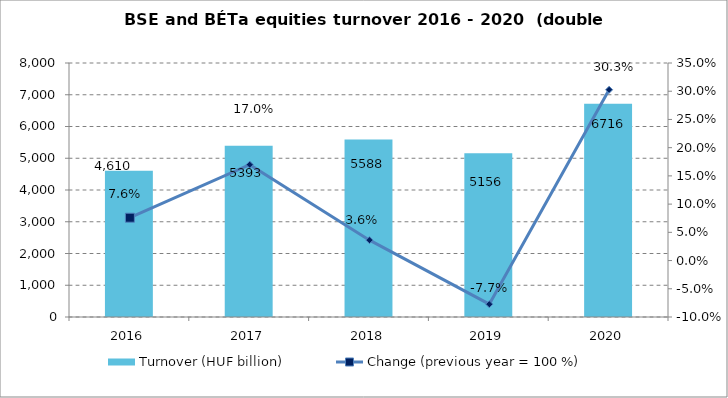
| Category | Turnover (HUF billion) |
|---|---|
| 2016.0 | 4610 |
| 2017.0 | 5393 |
| 2018.0 | 5588 |
| 2019.0 | 5156 |
| 2020.0 | 6716 |